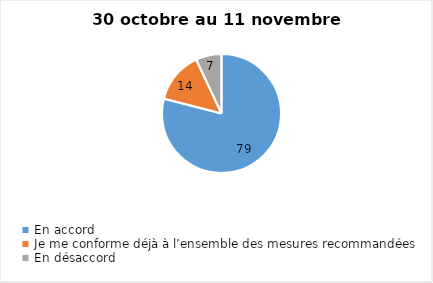
| Category | Series 0 |
|---|---|
| En accord | 79 |
| Je me conforme déjà à l’ensemble des mesures recommandées | 14 |
| En désaccord | 7 |